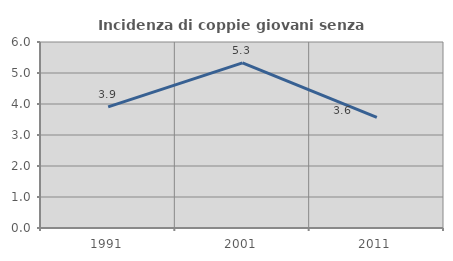
| Category | Incidenza di coppie giovani senza figli |
|---|---|
| 1991.0 | 3.908 |
| 2001.0 | 5.326 |
| 2011.0 | 3.571 |